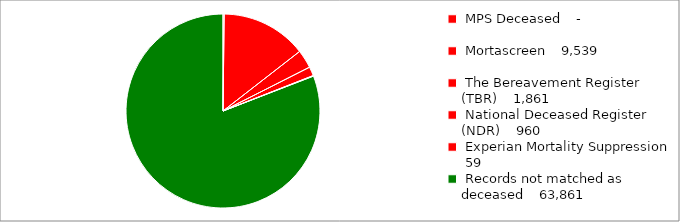
| Category | Series 0 |
|---|---|
| 0 | 144 |
| 1 | 10903 |
| 2 | 2332 |
| 3 | 1148 |
| 4 | 73 |
| 5 | 61680 |